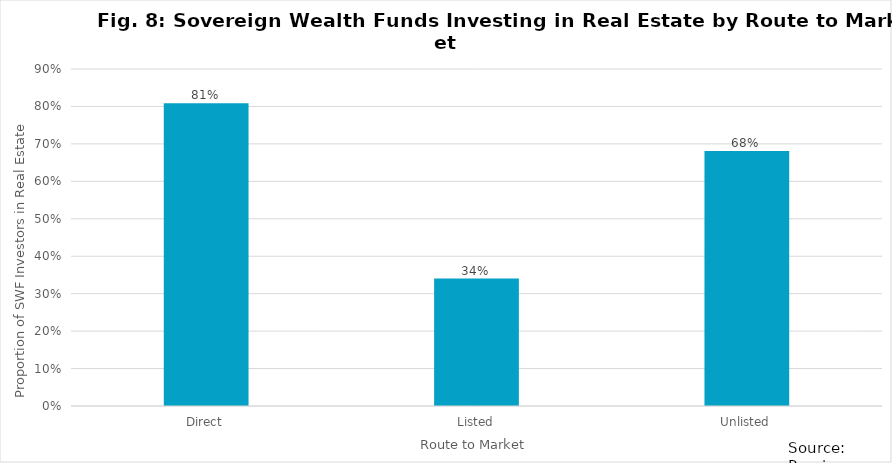
| Category | Series 0 |
|---|---|
| Direct | 0.809 |
| Listed | 0.34 |
| Unlisted | 0.681 |